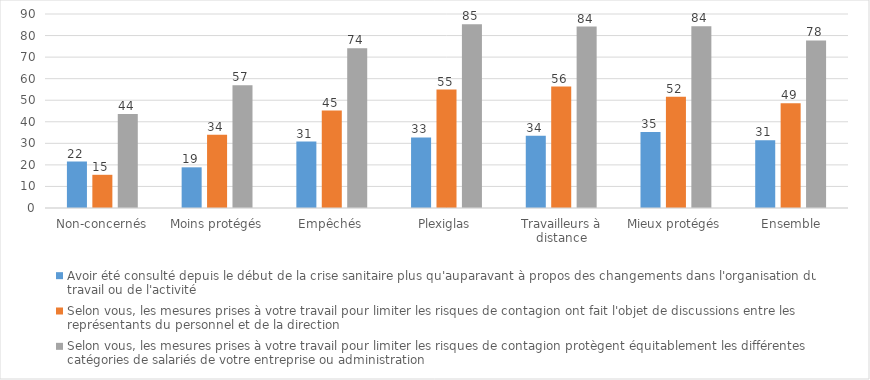
| Category | Avoir été consulté depuis le début de la crise sanitaire plus qu'auparavant à propos des changements dans l'organisation du travail ou de l'activité | Selon vous, les mesures prises à votre travail pour limiter les risques de contagion ont fait l'objet de discussions entre les représentants du personnel et de la direction | Selon vous, les mesures prises à votre travail pour limiter les risques de contagion protègent équitablement les différentes catégories de salariés de votre entreprise ou administration |
|---|---|---|---|
| Non-concernés | 21.54 | 15.4 | 43.63 |
| Moins protégés | 18.87 | 34.01 | 56.95 |
| Empêchés | 30.85 | 45.22 | 74.07 |
| Plexiglas | 32.73 | 54.95 | 85.29 |
| Travailleurs à distance | 33.57 | 56.33 | 84.16 |
| Mieux protégés | 35.22 | 51.58 | 84.27 |
|  Ensemble | 31.44 | 48.63 | 77.73 |